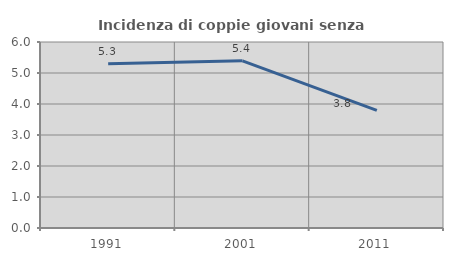
| Category | Incidenza di coppie giovani senza figli |
|---|---|
| 1991.0 | 5.301 |
| 2001.0 | 5.393 |
| 2011.0 | 3.795 |